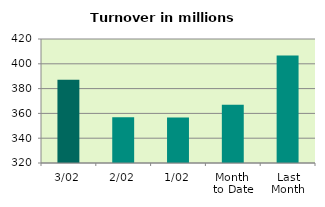
| Category | Series 0 |
|---|---|
| 3/02 | 387.073 |
| 2/02 | 356.928 |
| 1/02 | 356.767 |
| Month 
to Date | 366.923 |
| Last
Month | 406.741 |